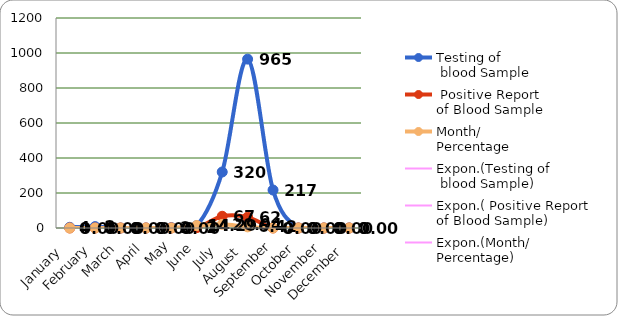
| Category | Testing of
 blood Sample |  Positive Report
of Blood Sample | Month/
Percentage |
|---|---|---|---|
| January  | 4 | 0 | 0 |
| February  | 8 | 0 | 0 |
| March | 0 | 0 | 0 |
| April  | 0 | 0 | 0 |
| May | 2 | 0 | 0 |
| June | 14 | 2 | 14.286 |
| July  | 320 | 67 | 20.938 |
| August  | 965 | 62 | 6.425 |
| September | 217 | 0 | 0 |
| October | 0 | 0 | 0 |
| November | 0 | 0 | 0 |
| December  | 0 | 0 | 0 |